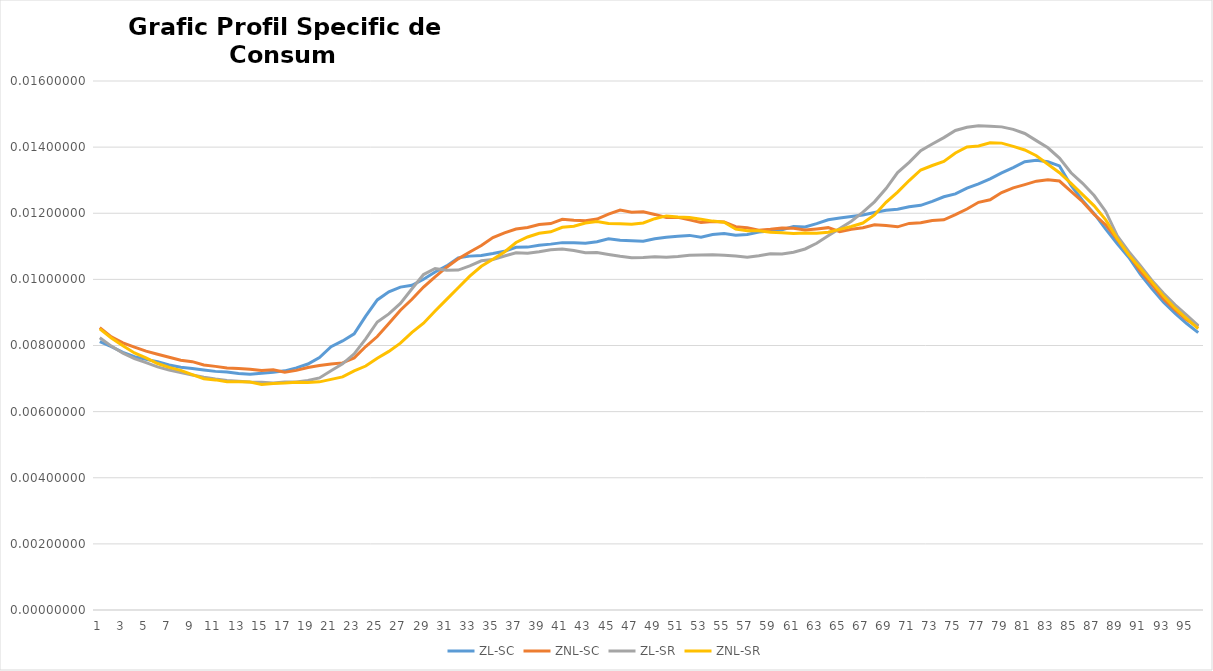
| Category | ZL-SC | ZNL-SC | ZL-SR | ZNL-SR |
|---|---|---|---|---|
| 0 | 0.008 | 0.009 | 0.008 | 0.009 |
| 1 | 0.008 | 0.008 | 0.008 | 0.008 |
| 2 | 0.008 | 0.008 | 0.008 | 0.008 |
| 3 | 0.008 | 0.008 | 0.008 | 0.008 |
| 4 | 0.008 | 0.008 | 0.007 | 0.008 |
| 5 | 0.008 | 0.008 | 0.007 | 0.007 |
| 6 | 0.007 | 0.008 | 0.007 | 0.007 |
| 7 | 0.007 | 0.008 | 0.007 | 0.007 |
| 8 | 0.007 | 0.008 | 0.007 | 0.007 |
| 9 | 0.007 | 0.007 | 0.007 | 0.007 |
| 10 | 0.007 | 0.007 | 0.007 | 0.007 |
| 11 | 0.007 | 0.007 | 0.007 | 0.007 |
| 12 | 0.007 | 0.007 | 0.007 | 0.007 |
| 13 | 0.007 | 0.007 | 0.007 | 0.007 |
| 14 | 0.007 | 0.007 | 0.007 | 0.007 |
| 15 | 0.007 | 0.007 | 0.007 | 0.007 |
| 16 | 0.007 | 0.007 | 0.007 | 0.007 |
| 17 | 0.007 | 0.007 | 0.007 | 0.007 |
| 18 | 0.007 | 0.007 | 0.007 | 0.007 |
| 19 | 0.008 | 0.007 | 0.007 | 0.007 |
| 20 | 0.008 | 0.007 | 0.007 | 0.007 |
| 21 | 0.008 | 0.007 | 0.007 | 0.007 |
| 22 | 0.008 | 0.008 | 0.008 | 0.007 |
| 23 | 0.009 | 0.008 | 0.008 | 0.007 |
| 24 | 0.009 | 0.008 | 0.009 | 0.008 |
| 25 | 0.01 | 0.009 | 0.009 | 0.008 |
| 26 | 0.01 | 0.009 | 0.009 | 0.008 |
| 27 | 0.01 | 0.009 | 0.01 | 0.008 |
| 28 | 0.01 | 0.01 | 0.01 | 0.009 |
| 29 | 0.01 | 0.01 | 0.01 | 0.009 |
| 30 | 0.01 | 0.01 | 0.01 | 0.009 |
| 31 | 0.011 | 0.011 | 0.01 | 0.01 |
| 32 | 0.011 | 0.011 | 0.01 | 0.01 |
| 33 | 0.011 | 0.011 | 0.011 | 0.01 |
| 34 | 0.011 | 0.011 | 0.011 | 0.011 |
| 35 | 0.011 | 0.011 | 0.011 | 0.011 |
| 36 | 0.011 | 0.012 | 0.011 | 0.011 |
| 37 | 0.011 | 0.012 | 0.011 | 0.011 |
| 38 | 0.011 | 0.012 | 0.011 | 0.011 |
| 39 | 0.011 | 0.012 | 0.011 | 0.011 |
| 40 | 0.011 | 0.012 | 0.011 | 0.012 |
| 41 | 0.011 | 0.012 | 0.011 | 0.012 |
| 42 | 0.011 | 0.012 | 0.011 | 0.012 |
| 43 | 0.011 | 0.012 | 0.011 | 0.012 |
| 44 | 0.011 | 0.012 | 0.011 | 0.012 |
| 45 | 0.011 | 0.012 | 0.011 | 0.012 |
| 46 | 0.011 | 0.012 | 0.011 | 0.012 |
| 47 | 0.011 | 0.012 | 0.011 | 0.012 |
| 48 | 0.011 | 0.012 | 0.011 | 0.012 |
| 49 | 0.011 | 0.012 | 0.011 | 0.012 |
| 50 | 0.011 | 0.012 | 0.011 | 0.012 |
| 51 | 0.011 | 0.012 | 0.011 | 0.012 |
| 52 | 0.011 | 0.012 | 0.011 | 0.012 |
| 53 | 0.011 | 0.012 | 0.011 | 0.012 |
| 54 | 0.011 | 0.012 | 0.011 | 0.012 |
| 55 | 0.011 | 0.012 | 0.011 | 0.012 |
| 56 | 0.011 | 0.012 | 0.011 | 0.011 |
| 57 | 0.011 | 0.011 | 0.011 | 0.011 |
| 58 | 0.011 | 0.012 | 0.011 | 0.011 |
| 59 | 0.012 | 0.012 | 0.011 | 0.011 |
| 60 | 0.012 | 0.012 | 0.011 | 0.011 |
| 61 | 0.012 | 0.011 | 0.011 | 0.011 |
| 62 | 0.012 | 0.012 | 0.011 | 0.011 |
| 63 | 0.012 | 0.012 | 0.011 | 0.011 |
| 64 | 0.012 | 0.011 | 0.012 | 0.012 |
| 65 | 0.012 | 0.012 | 0.012 | 0.012 |
| 66 | 0.012 | 0.012 | 0.012 | 0.012 |
| 67 | 0.012 | 0.012 | 0.012 | 0.012 |
| 68 | 0.012 | 0.012 | 0.013 | 0.012 |
| 69 | 0.012 | 0.012 | 0.013 | 0.013 |
| 70 | 0.012 | 0.012 | 0.014 | 0.013 |
| 71 | 0.012 | 0.012 | 0.014 | 0.013 |
| 72 | 0.012 | 0.012 | 0.014 | 0.013 |
| 73 | 0.012 | 0.012 | 0.014 | 0.014 |
| 74 | 0.013 | 0.012 | 0.015 | 0.014 |
| 75 | 0.013 | 0.012 | 0.015 | 0.014 |
| 76 | 0.013 | 0.012 | 0.015 | 0.014 |
| 77 | 0.013 | 0.012 | 0.015 | 0.014 |
| 78 | 0.013 | 0.013 | 0.015 | 0.014 |
| 79 | 0.013 | 0.013 | 0.015 | 0.014 |
| 80 | 0.014 | 0.013 | 0.014 | 0.014 |
| 81 | 0.014 | 0.013 | 0.014 | 0.014 |
| 82 | 0.014 | 0.013 | 0.014 | 0.013 |
| 83 | 0.013 | 0.013 | 0.014 | 0.013 |
| 84 | 0.013 | 0.013 | 0.013 | 0.013 |
| 85 | 0.012 | 0.012 | 0.013 | 0.013 |
| 86 | 0.012 | 0.012 | 0.013 | 0.012 |
| 87 | 0.012 | 0.012 | 0.012 | 0.012 |
| 88 | 0.011 | 0.011 | 0.011 | 0.011 |
| 89 | 0.011 | 0.011 | 0.011 | 0.011 |
| 90 | 0.01 | 0.01 | 0.01 | 0.01 |
| 91 | 0.01 | 0.01 | 0.01 | 0.01 |
| 92 | 0.009 | 0.009 | 0.01 | 0.009 |
| 93 | 0.009 | 0.009 | 0.009 | 0.009 |
| 94 | 0.009 | 0.009 | 0.009 | 0.009 |
| 95 | 0.008 | 0.009 | 0.009 | 0.009 |